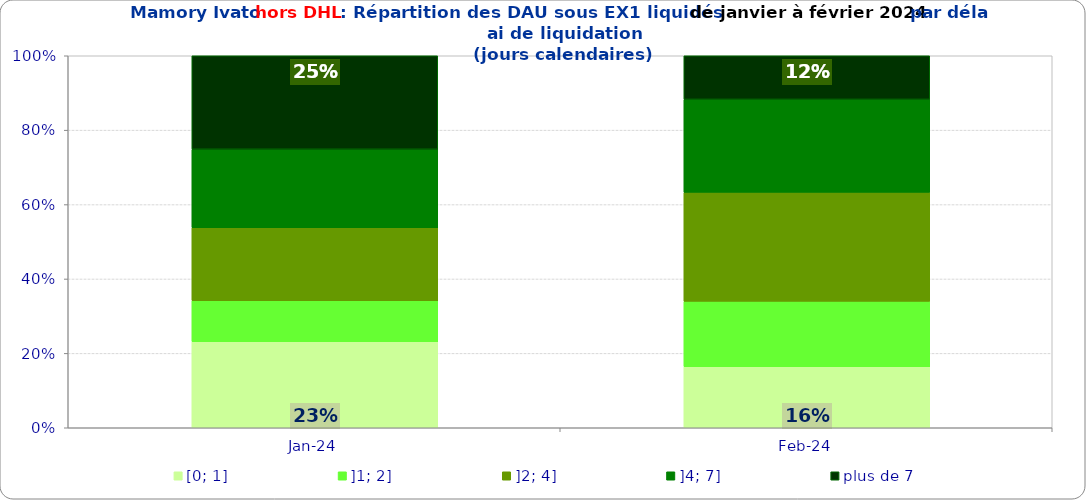
| Category | [0; 1] | ]1; 2] | ]2; 4] | ]4; 7] | plus de 7 |
|---|---|---|---|---|---|
| 2024-01-01 | 0.231 | 0.111 | 0.196 | 0.211 | 0.251 |
| 2024-02-01 | 0.164 | 0.176 | 0.293 | 0.25 | 0.117 |